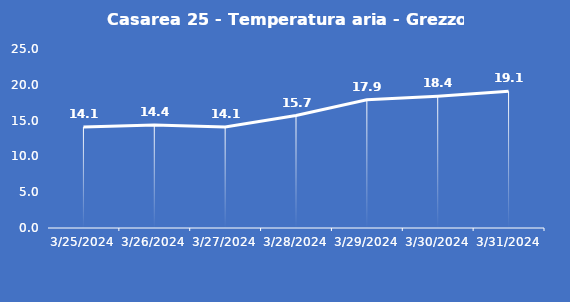
| Category | Casarea 25 - Temperatura aria - Grezzo (°C) |
|---|---|
| 3/25/24 | 14.1 |
| 3/26/24 | 14.4 |
| 3/27/24 | 14.1 |
| 3/28/24 | 15.7 |
| 3/29/24 | 17.9 |
| 3/30/24 | 18.4 |
| 3/31/24 | 19.1 |